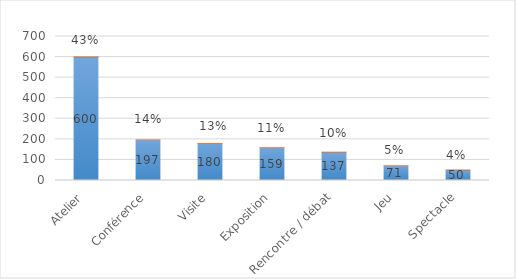
| Category | Atelier |
|---|---|
| Atelier | 0.43 |
| Conférence | 0.141 |
| Visite | 0.129 |
| Exposition | 0.114 |
| Rencontre / débat | 0.098 |
| Jeu | 0.051 |
| Spectacle | 0.036 |